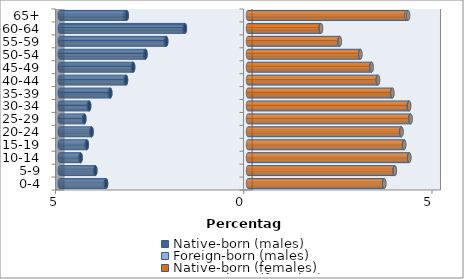
| Category | Native-born (males) | Foreign-born (males) | Native-born (females) | Foreign-born (females) |
|---|---|---|---|---|
| 0-4 | -3.77 | -0.005 | 3.615 | 0.005 |
| 5-9 | -4.055 | -0.005 | 3.895 | 0.005 |
| 10-14 | -4.446 | -0.005 | 4.279 | 0.005 |
| 15-19 | -4.281 | -0.006 | 4.143 | 0.006 |
| 20-24 | -4.154 | -0.007 | 4.071 | 0.007 |
| 25-29 | -4.347 | -0.009 | 4.311 | 0.008 |
| 30-34 | -4.219 | -0.01 | 4.274 | 0.008 |
| 35-39 | -3.658 | -0.01 | 3.828 | 0.008 |
| 40-44 | -3.24 | -0.01 | 3.448 | 0.007 |
| 45-49 | -3.05 | -0.01 | 3.278 | 0.007 |
| 50-54 | -2.723 | -0.01 | 2.978 | 0.007 |
| 55-59 | -2.171 | -0.012 | 2.43 | 0.01 |
| 60-64 | -1.677 | -0.014 | 1.929 | 0.012 |
| 65+ | -3.221 | -0.048 | 4.21 | 0.045 |